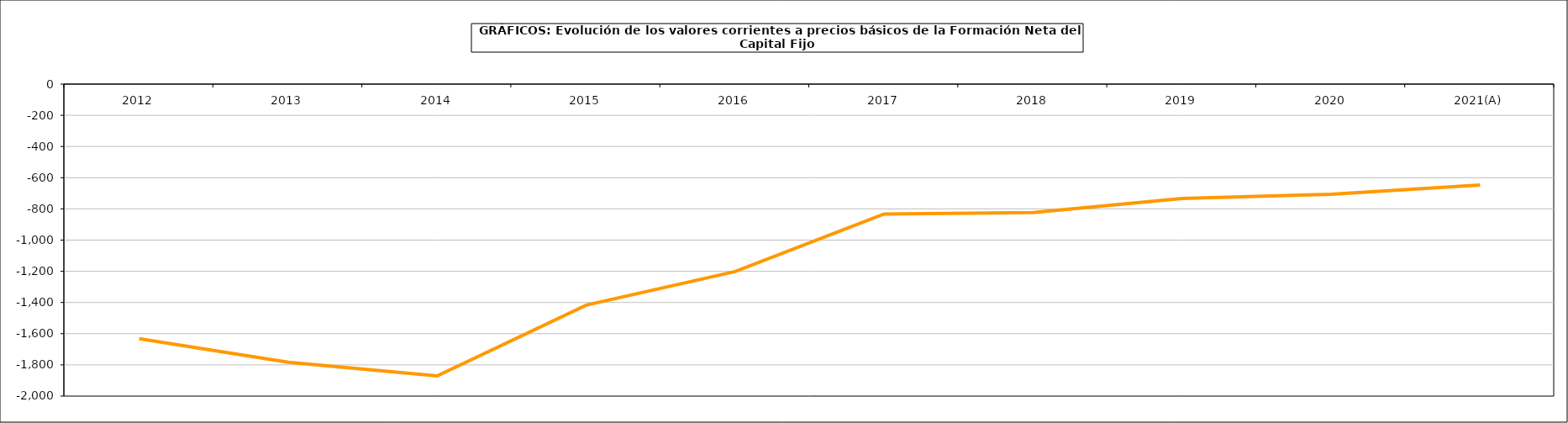
| Category | Formación neta del capital fijo |
|---|---|
| 2012 | -1631.605 |
| 2013 | -1783.499 |
| 2014 | -1870.615 |
| 2015 | -1417.245 |
| 2016 | -1201.233 |
| 2017 | -832.33 |
| 2018 | -823.176 |
| 2019 | -732.961 |
| 2020 | -706.78 |
| 2021(A) | -646.64 |